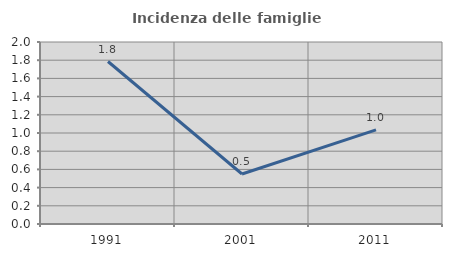
| Category | Incidenza delle famiglie numerose |
|---|---|
| 1991.0 | 1.786 |
| 2001.0 | 0.549 |
| 2011.0 | 1.035 |